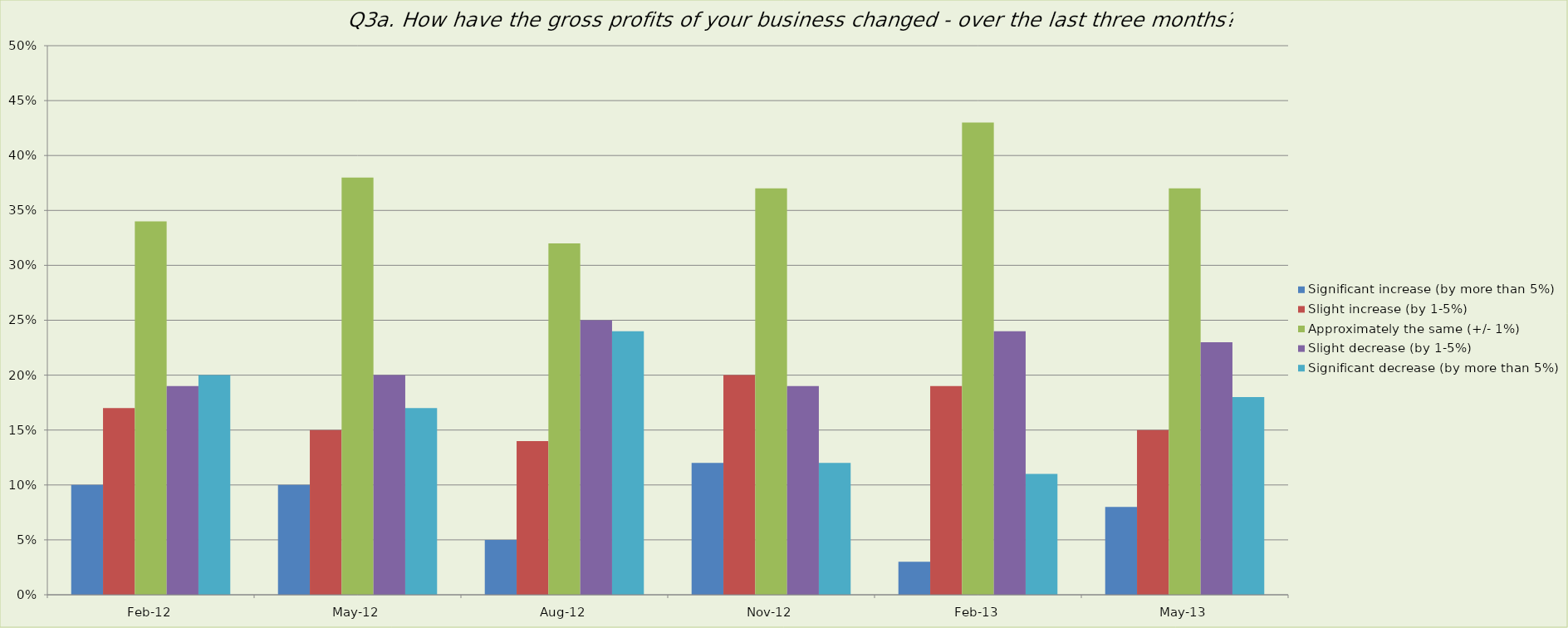
| Category | Significant increase (by more than 5%) | Slight increase (by 1-5%) | Approximately the same (+/- 1%) | Slight decrease (by 1-5%) | Significant decrease (by more than 5%) |
|---|---|---|---|---|---|
| 2012-02-01 | 0.1 | 0.17 | 0.34 | 0.19 | 0.2 |
| 2012-05-01 | 0.1 | 0.15 | 0.38 | 0.2 | 0.17 |
| 2012-08-01 | 0.05 | 0.14 | 0.32 | 0.25 | 0.24 |
| 2012-11-01 | 0.12 | 0.2 | 0.37 | 0.19 | 0.12 |
| 2013-02-01 | 0.03 | 0.19 | 0.43 | 0.24 | 0.11 |
| 2013-05-01 | 0.08 | 0.15 | 0.37 | 0.23 | 0.18 |